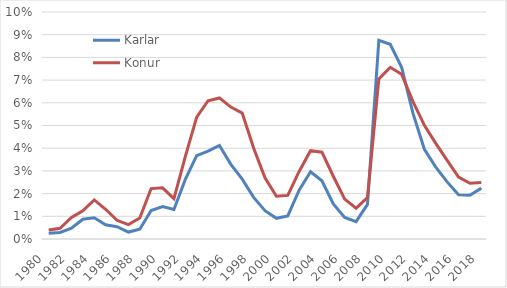
| Category | Karlar | Konur |
|---|---|---|
| 1980.0 | 0.257 | 0.394 |
| 1981.0 | 0.291 | 0.475 |
| 1982.0 | 0.478 | 0.952 |
| 1983.0 | 0.87 | 1.244 |
| 1984.0 | 0.933 | 1.723 |
| 1985.0 | 0.629 | 1.31 |
| 1986.0 | 0.542 | 0.822 |
| 1987.0 | 0.306 | 0.632 |
| 1988.0 | 0.432 | 0.924 |
| 1989.0 | 1.254 | 2.222 |
| 1990.0 | 1.432 | 2.253 |
| 1991.0 | 1.3 | 1.777 |
| 1992.0 | 2.626 | 3.632 |
| 1993.0 | 3.671 | 5.373 |
| 1994.0 | 3.868 | 6.092 |
| 1995.0 | 4.121 | 6.215 |
| 1996.0 | 3.287 | 5.81 |
| 1997.0 | 2.639 | 5.549 |
| 1998.0 | 1.833 | 4.012 |
| 1999.0 | 1.248 | 2.693 |
| 2000.0 | 0.912 | 1.885 |
| 2001.0 | 1.014 | 1.922 |
| 2002.0 | 2.147 | 2.977 |
| 2003.0 | 2.96 | 3.891 |
| 2004.0 | 2.564 | 3.825 |
| 2005.0 | 1.542 | 2.764 |
| 2006.0 | 0.948 | 1.756 |
| 2007.0 | 0.764 | 1.358 |
| 2008.0 | 1.525 | 1.823 |
| 2009.0 | 8.757 | 7.055 |
| 2010.0 | 8.577 | 7.562 |
| 2011.0 | 7.562 | 7.259 |
| 2012.0 | 5.535 | 6.055 |
| 2013.0 | 3.952 | 5.009 |
| 2014.0 | 3.166 | 4.215 |
| 2015.0 | 2.515 | 3.463 |
| 2016.0 | 1.948 | 2.723 |
| 2017.0 | 1.926 | 2.453 |
| 2018.0 | 2.241 | 2.486 |